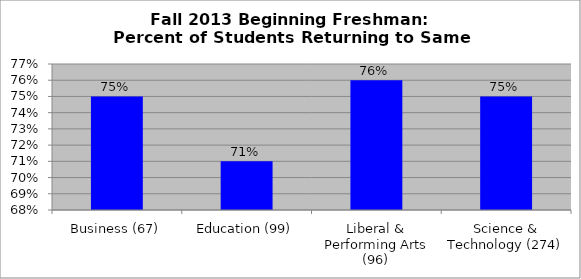
| Category | Series 0 |
|---|---|
| Business (67) | 0.75 |
| Education (99) | 0.71 |
| Liberal & Performing Arts (96) | 0.76 |
| Science & Technology (274) | 0.75 |